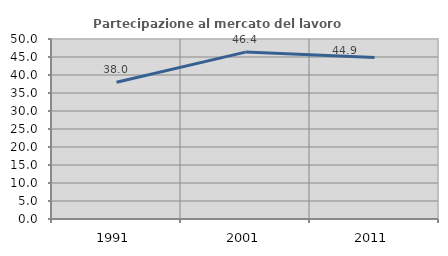
| Category | Partecipazione al mercato del lavoro  femminile |
|---|---|
| 1991.0 | 37.977 |
| 2001.0 | 46.363 |
| 2011.0 | 44.89 |